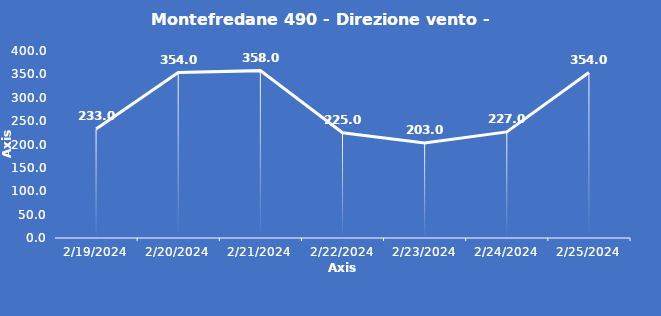
| Category | Montefredane 490 - Direzione vento - Grezzo (°N) |
|---|---|
| 2/19/24 | 233 |
| 2/20/24 | 354 |
| 2/21/24 | 358 |
| 2/22/24 | 225 |
| 2/23/24 | 203 |
| 2/24/24 | 227 |
| 2/25/24 | 354 |